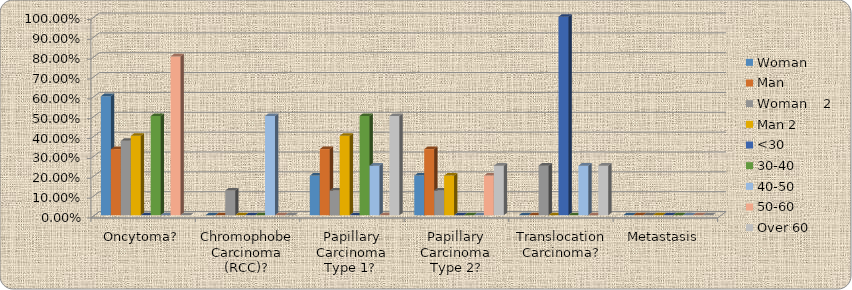
| Category | Woman     | Man  | Woman    2 | Man 2 | <30 | 30-40 | 40-50 | 50-60 | Over 60 |
|---|---|---|---|---|---|---|---|---|---|
| Oncytoma? | 0.6 | 0.333 | 0.375 | 0.4 | 0 | 0.5 | 0 | 0.8 | 0 |
| Chromophobe Carcinoma (RCC)? | 0 | 0 | 0.125 | 0 | 0 | 0 | 0.5 | 0 | 0 |
| Papillary Carcinoma Type 1?  | 0.2 | 0.333 | 0.125 | 0.4 | 0 | 0.5 | 0.25 | 0 | 0.5 |
| Papillary Carcinoma Type 2? | 0.2 | 0.333 | 0.125 | 0.2 | 0 | 0 | 0 | 0.2 | 0.25 |
| Translocation Carcinoma? | 0 | 0 | 0.25 | 0 | 1 | 0 | 0.25 | 0 | 0.25 |
| Metastasis | 0 | 0 | 0 | 0 | 0 | 0 | 0 | 0 | 0 |